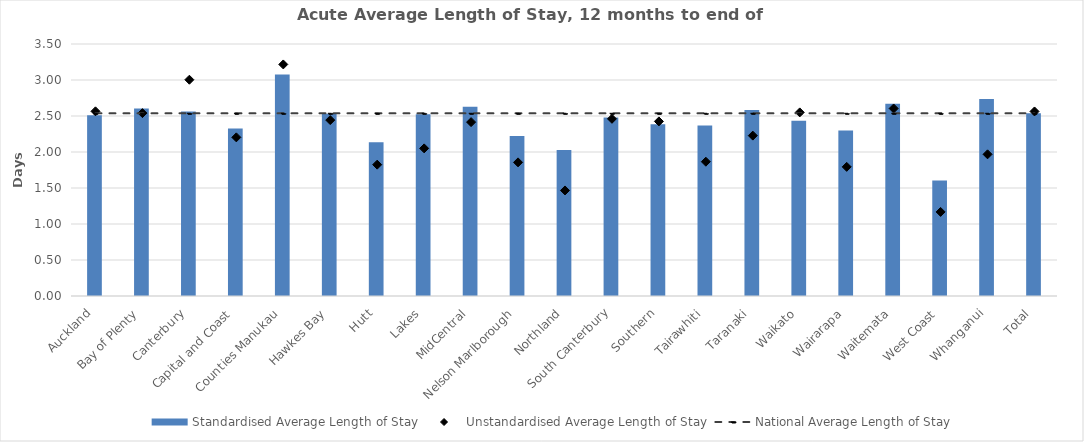
| Category | Standardised Average Length of Stay |
|---|---|
| Auckland | 2.512 |
| Bay of Plenty | 2.603 |
| Canterbury | 2.561 |
| Capital and Coast | 2.325 |
| Counties Manukau | 3.075 |
| Hawkes Bay | 2.532 |
| Hutt | 2.136 |
| Lakes | 2.526 |
| MidCentral | 2.628 |
| Nelson Marlborough | 2.224 |
| Northland | 2.028 |
| South Canterbury | 2.479 |
| Southern | 2.385 |
| Tairawhiti | 2.368 |
| Taranaki | 2.582 |
| Waikato | 2.436 |
| Wairarapa | 2.297 |
| Waitemata | 2.67 |
| West Coast | 1.605 |
| Whanganui | 2.738 |
| Total | 2.538 |